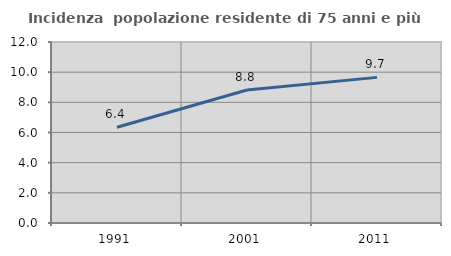
| Category | Incidenza  popolazione residente di 75 anni e più |
|---|---|
| 1991.0 | 6.352 |
| 2001.0 | 8.822 |
| 2011.0 | 9.655 |